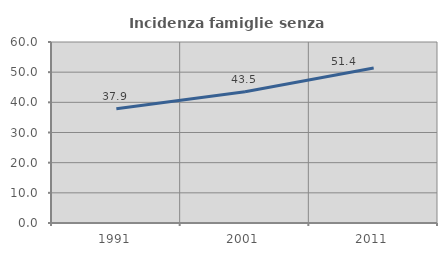
| Category | Incidenza famiglie senza nuclei |
|---|---|
| 1991.0 | 37.861 |
| 2001.0 | 43.536 |
| 2011.0 | 51.356 |